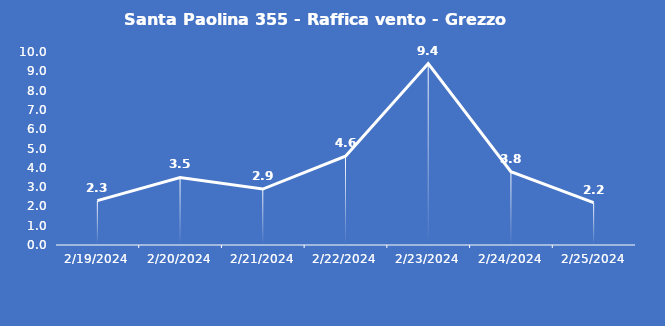
| Category | Santa Paolina 355 - Raffica vento - Grezzo (m/s) |
|---|---|
| 2/19/24 | 2.3 |
| 2/20/24 | 3.5 |
| 2/21/24 | 2.9 |
| 2/22/24 | 4.6 |
| 2/23/24 | 9.4 |
| 2/24/24 | 3.8 |
| 2/25/24 | 2.2 |